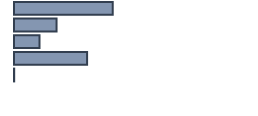
| Category | Percentatge |
|---|---|
| 0 | 41.136 |
| 1 | 17.727 |
| 2 | 10.606 |
| 3 | 30.455 |
| 4 | 0.076 |
| 5 | 0 |